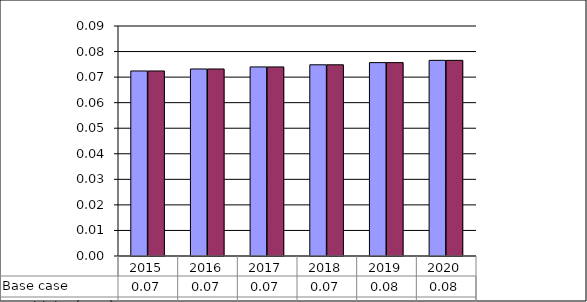
| Category | Base case | Sensitivity (MEO) |
|---|---|---|
| 2015.0 | 0.072 | 0.072 |
| 2016.0 | 0.073 | 0.073 |
| 2017.0 | 0.074 | 0.074 |
| 2018.0 | 0.075 | 0.075 |
| 2019.0 | 0.076 | 0.076 |
| 2020.0 | 0.077 | 0.077 |